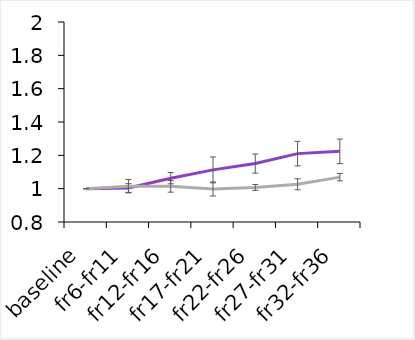
| Category | Series 0 | Series 1 |
|---|---|---|
| baseline | 1 | 1 |
| fr6-fr11 | 1.004 | 1.015 |
| fr12-fr16 | 1.063 | 1.014 |
| fr17-fr21 | 1.113 | 0.998 |
| fr22-fr26 | 1.151 | 1.008 |
| fr27-fr31 | 1.21 | 1.026 |
| fr32-fr36 | 1.224 | 1.069 |